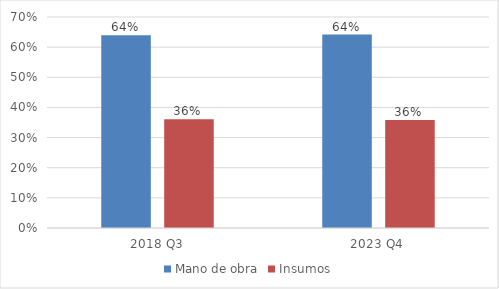
| Category | Mano de obra | Insumos |
|---|---|---|
| 2018 Q3 | 0.639 | 0.361 |
| 2023 Q4 | 0.642 | 0.358 |